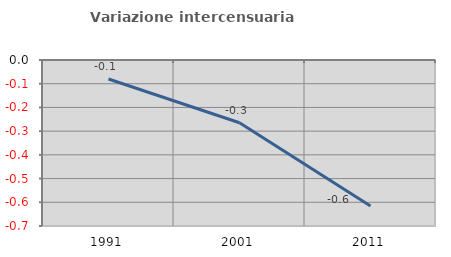
| Category | Variazione intercensuaria annua |
|---|---|
| 1991.0 | -0.08 |
| 2001.0 | -0.265 |
| 2011.0 | -0.616 |